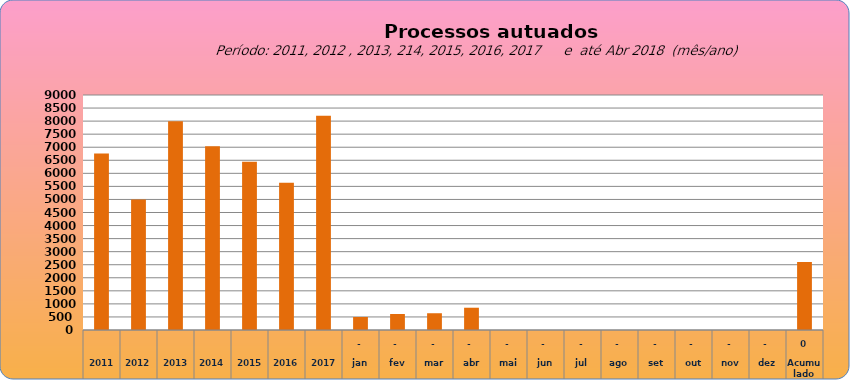
| Category | 6755 |
|---|---|
| 2011 | 6755 |
| 2012 | 4997 |
| 2013 | 7990 |
| 2014 | 7034 |
| 2015 | 6446 |
| 2016 | 5644 |
| 2017 | 8210 |
| jan | 498 |
| fev | 612 |
| mar | 642 |
| abr | 853 |
| mai | 0 |
| jun | 0 |
| jul | 0 |
| ago | 0 |
| set | 0 |
| out | 0 |
| nov | 0 |
| dez | 0 |
| Acumulado
 | 2605 |